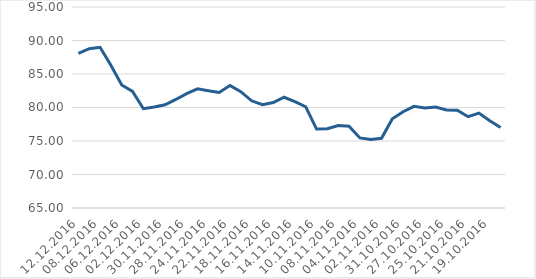
| Category | Series 3 |
|---|---|
| 12.12.2016 | 88.09 |
| 09.12.2016 | 88.77 |
| 08.12.2016 | 88.99 |
| 07.12.2016 | 86.32 |
| 06.12.2016 | 83.37 |
| 05.12.2016 | 82.4 |
| 02.12.2016 | 79.82 |
| 01.12.2016 | 80.07 |
| 30.11.2016 | 80.41 |
| 29.11.2016 | 81.2 |
| 28.11.2016 | 82.06 |
| 25.11.2016 | 82.79 |
| 24.11.2016 | 82.51 |
| 23.11.2016 | 82.24 |
| 22.11.2016 | 83.3 |
| 21.11.2016 | 82.37 |
| 18.11.2016 | 81 |
| 17.11.2016 | 80.42 |
| 16.11.2016 | 80.74 |
| 15.11.2016 | 81.53 |
| 14.11.2016 | 80.88 |
| 11.11.2016 | 80.11 |
| 10.11.2016 | 76.78 |
| 09.11.2016 | 76.84 |
| 08.11.2016 | 77.31 |
| 07.11.2016 | 77.2 |
| 04.11.2016 | 75.46 |
| 03.11.2016 | 75.23 |
| 02.11.2016 | 75.4 |
| 01.11.2016 | 78.32 |
| 31.10.2016 | 79.37 |
| 28.10.2016 | 80.17 |
| 27.10.2016 | 79.92 |
| 26.10.2016 | 80.07 |
| 25.10.2016 | 79.63 |
| 24.10.2016 | 79.59 |
| 21.10.2016 | 78.63 |
| 20.10.2016 | 79.17 |
| 19.10.2016 | 78.02 |
| 18.10.2016 | 77.01 |